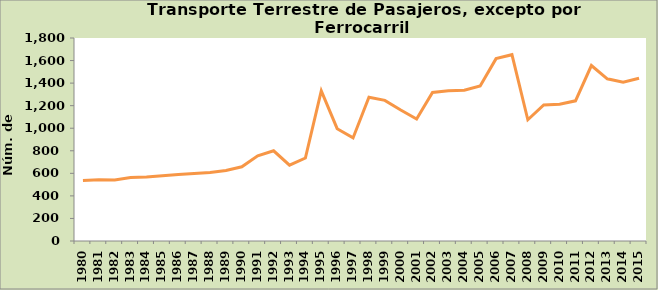
| Category | Series 0 |
|---|---|
| 1980.0 | 537 |
| 1981.0 | 543 |
| 1982.0 | 541 |
| 1983.0 | 563 |
| 1984.0 | 568 |
| 1985.0 | 579 |
| 1986.0 | 589 |
| 1987.0 | 599 |
| 1988.0 | 607 |
| 1989.0 | 625 |
| 1990.0 | 658 |
| 1991.0 | 755 |
| 1992.0 | 800 |
| 1993.0 | 672 |
| 1994.0 | 736 |
| 1995.0 | 1331 |
| 1996.0 | 996 |
| 1997.0 | 914 |
| 1998.0 | 1275 |
| 1999.0 | 1247 |
| 2000.0 | 1161 |
| 2001.0 | 1082 |
| 2002.0 | 1317 |
| 2003.0 | 1333 |
| 2004.0 | 1337 |
| 2005.0 | 1375 |
| 2006.0 | 1617 |
| 2007.0 | 1652 |
| 2008.0 | 1075 |
| 2009.0 | 1207 |
| 2010.0 | 1213 |
| 2011.0 | 1243 |
| 2012.0 | 1556 |
| 2013.0 | 1438 |
| 2014.0 | 1409 |
| 2015.0 | 1443 |